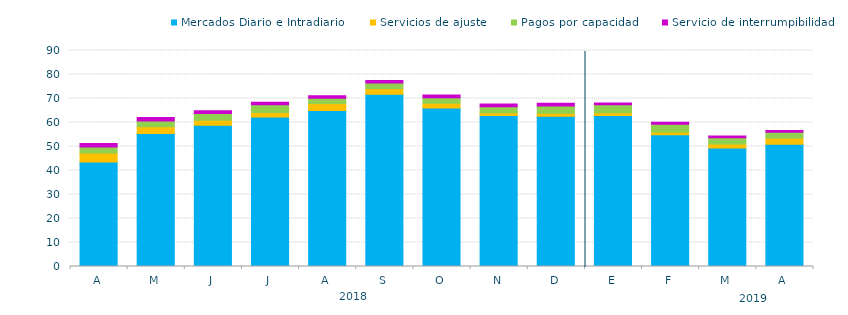
| Category | Mercados Diario e Intradiario  | Servicios de ajuste | Pagos por capacidad | Servicio de interrumpibilidad |
|---|---|---|---|---|
| A | 43.53 | 3.79 | 2.42 | 1.53 |
| M | 55.4 | 2.87 | 2.35 | 1.47 |
| J | 58.82 | 2.11 | 2.8 | 1.12 |
| J | 62.3 | 1.83 | 3.26 | 1.03 |
| A | 64.95 | 2.99 | 2.18 | 1.03 |
| S | 71.77 | 2.27 | 2.41 | 1.1 |
| O | 66.06 | 1.93 | 2.36 | 1.12 |
| N | 62.9 | 1.18 | 2.5 | 1.09 |
| D | 62.58 | 1.29 | 3.02 | 1.08 |
| E | 62.95 | 1.14 | 3.26 | 0.73 |
| F | 54.9 | 1.15 | 3.21 | 0.84 |
| M | 49.34 | 1.74 | 2.53 | 0.73 |
| A | 50.89 | 2.56 | 2.45 | 0.78 |